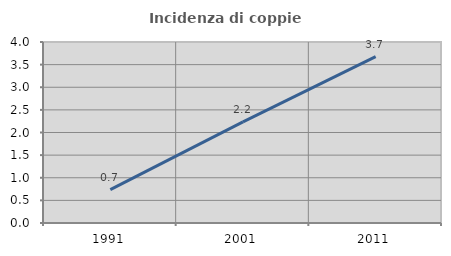
| Category | Incidenza di coppie miste |
|---|---|
| 1991.0 | 0.738 |
| 2001.0 | 2.235 |
| 2011.0 | 3.676 |